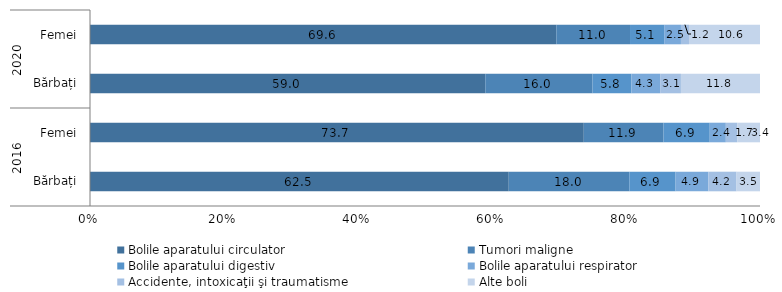
| Category | Bolile aparatului circulator | Tumori maligne | Bolile aparatului digestiv | Bolile aparatului respirator | Accidente, intoxicaţii şi traumatisme | Alte boli |
|---|---|---|---|---|---|---|
| 0 | 62.5 | 18 | 6.9 | 4.9 | 4.2 | 3.5 |
| 1 | 73.7 | 11.9 | 6.9 | 2.4 | 1.7 | 3.4 |
| 2 | 59 | 16 | 5.8 | 4.3 | 3.1 | 11.8 |
| 3 | 69.6 | 11 | 5.1 | 2.5 | 1.2 | 10.6 |